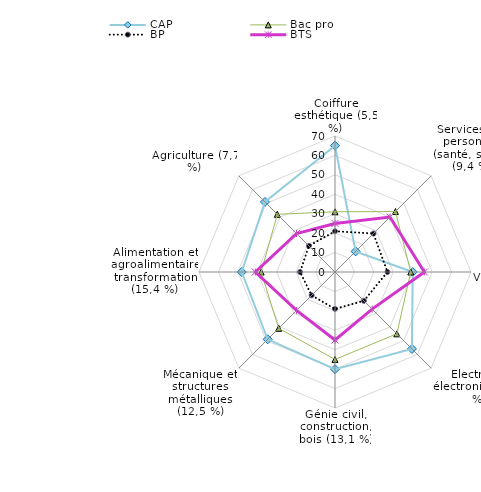
| Category | CAP | Bac pro | BP | BTS |
|---|---|---|---|---|
| Coiffure esthétique (5,5 %) | 65 | 31 | 21 | 25 |
| Services aux personnes (santé, social) (9,4 %) | 15 | 44 | 28 | 40 |
| Commerce, Vente (12,7 %) | 40 | 39 | 27 | 46 |
| Electricité, électronique (4,2 %) | 56 | 45 | 21 | 27 |
| Génie civil, construction, bois (13,1 %) | 50 | 45 | 19 | 35 |
| Mécanique et structures métalliques (12,5 %) | 49 | 41 | 17 | 28 |
| Alimentation et agroalimentaire transformation (15,4 %) | 48 | 38 | 18 | 41 |
| Agriculture (7,7 %) | 51 | 42 | 19 | 28 |